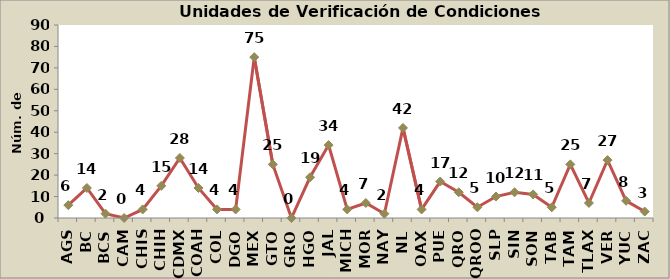
| Category | Total |
|---|---|
| AGS | 6 |
| BC | 14 |
| BCS | 2 |
| CAM | 0 |
| CHIS | 4 |
| CHIH | 15 |
| CDMX | 28 |
| COAH | 14 |
| COL | 4 |
| DGO | 4 |
| MEX | 75 |
| GTO | 25 |
| GRO | 0 |
| HGO | 19 |
| JAL | 34 |
| MICH | 4 |
| MOR | 7 |
| NAY | 2 |
| NL | 42 |
| OAX | 4 |
| PUE | 17 |
| QRO | 12 |
| QROO | 5 |
| SLP | 10 |
| SIN | 12 |
| SON | 11 |
| TAB | 5 |
| TAM | 25 |
| TLAX | 7 |
| VER | 27 |
| YUC | 8 |
| ZAC | 3 |